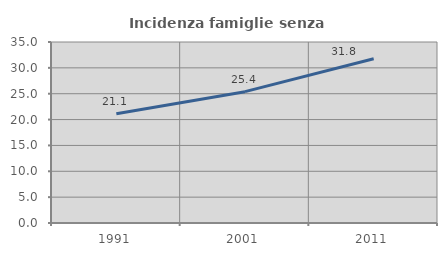
| Category | Incidenza famiglie senza nuclei |
|---|---|
| 1991.0 | 21.122 |
| 2001.0 | 25.397 |
| 2011.0 | 31.756 |